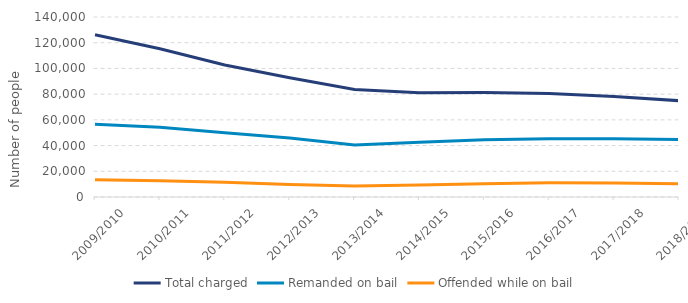
| Category | Total charged | Remanded on bail | Offended while on bail |
|---|---|---|---|
| 2009/2010 | 126189 | 56553 | 13492 |
| 2010/2011 | 115261 | 54192 | 12572 |
| 2011/2012 | 102708 | 50024 | 11536 |
| 2012/2013 | 92678 | 45805 | 9719 |
| 2013/2014 | 83618 | 40431 | 8521 |
| 2014/2015 | 81113 | 42586 | 9343 |
| 2015/2016 | 81360 | 44483 | 10298 |
| 2016/2017 | 80528 | 45292 | 11049 |
| 2017/2018 | 78102 | 45247 | 10886 |
| 2018/2019 | 74907 | 44680 | 10332 |